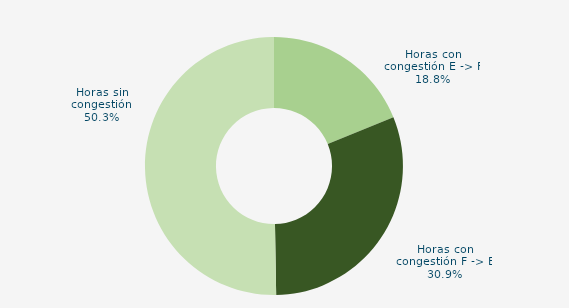
| Category | Horas con congestión E -> F |
|---|---|
| Horas con congestión E -> F | 18.817 |
| Horas con congestión F -> E | 30.914 |
| Horas sin congestión | 50.269 |